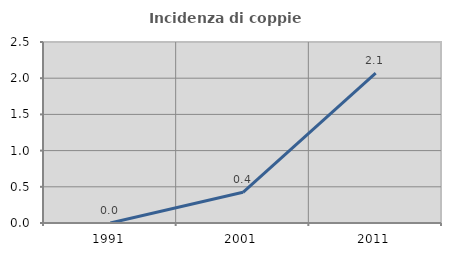
| Category | Incidenza di coppie miste |
|---|---|
| 1991.0 | 0 |
| 2001.0 | 0.424 |
| 2011.0 | 2.07 |